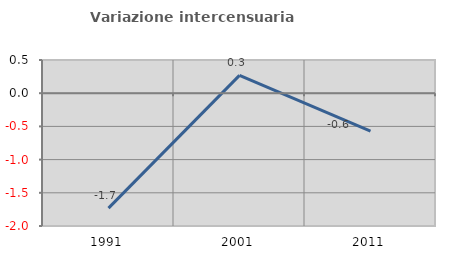
| Category | Variazione intercensuaria annua |
|---|---|
| 1991.0 | -1.731 |
| 2001.0 | 0.269 |
| 2011.0 | -0.572 |